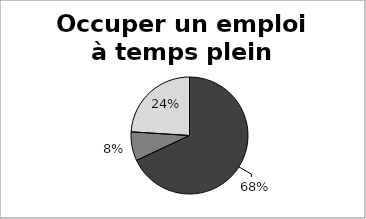
| Category | Occuper un emploi à temps plein |
|---|---|
| Part expliquée par les différences de disciplines (ségrégation éducative) | 0.68 |
| Part expliquée par les différences de type et de secteur d'activité de l'employeur (ségrégation professionnelle) | 0.08 |
| Part "non-expliquée" par le modèle (ségrégation socio-culturelle) | 0.24 |